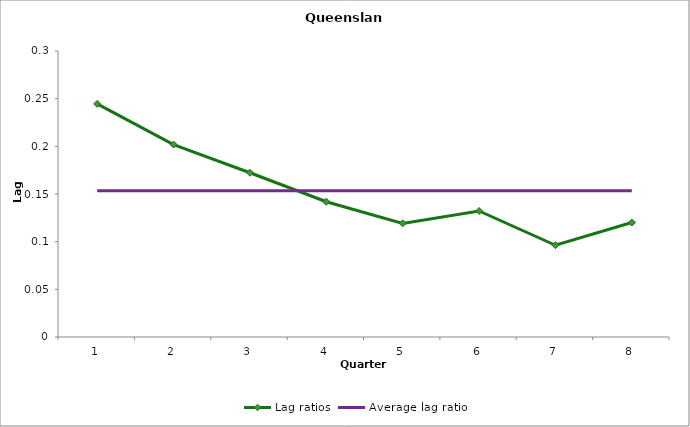
| Category | Lag ratios | Average lag ratio |
|---|---|---|
| 0 | 0.245 | 0.154 |
| 1 | 0.202 | 0.154 |
| 2 | 0.172 | 0.154 |
| 3 | 0.142 | 0.154 |
| 4 | 0.119 | 0.154 |
| 5 | 0.132 | 0.154 |
| 6 | 0.096 | 0.154 |
| 7 | 0.12 | 0.154 |